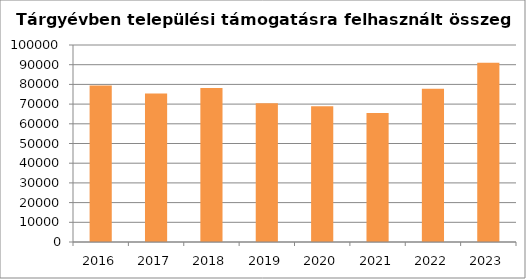
| Category | Tárgyévben települési támogatásra felhasznált összeg (eFt) |
|---|---|
| 2016.0 | 79439 |
| 2017.0 | 75358 |
| 2018.0 | 78223 |
| 2019.0 | 70394 |
| 2020.0 | 68905 |
| 2021.0 | 65440 |
| 2022.0 | 77739 |
| 2023.0 | 90944 |